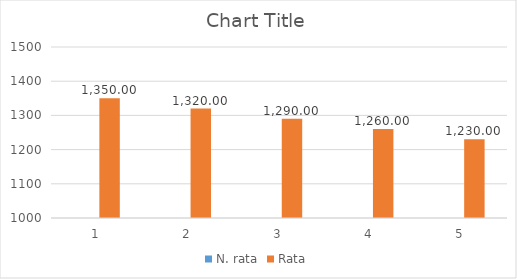
| Category | N. rata | Rata |
|---|---|---|
| 0 | 1 | 1350 |
| 1 | 2 | 1320 |
| 2 | 3 | 1290 |
| 3 | 4 | 1260 |
| 4 | 5 | 1230 |